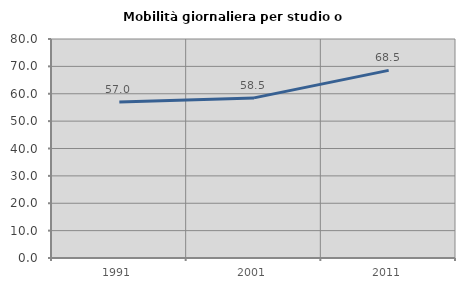
| Category | Mobilità giornaliera per studio o lavoro |
|---|---|
| 1991.0 | 56.962 |
| 2001.0 | 58.492 |
| 2011.0 | 68.54 |